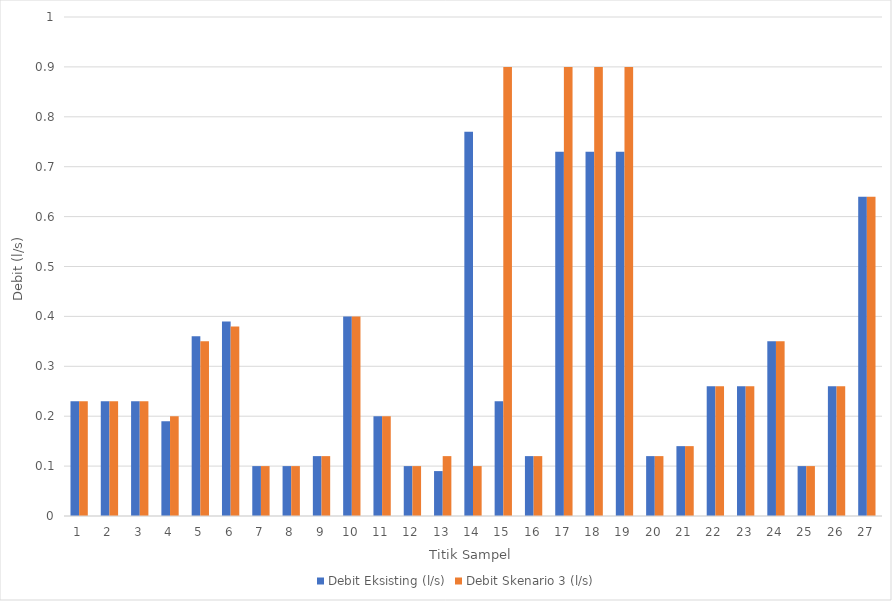
| Category | Debit Eksisting (l/s) | Debit Skenario 3 (l/s) |
|---|---|---|
| 0 | 0.23 | 0.23 |
| 1 | 0.23 | 0.23 |
| 2 | 0.23 | 0.23 |
| 3 | 0.19 | 0.2 |
| 4 | 0.36 | 0.35 |
| 5 | 0.39 | 0.38 |
| 6 | 0.1 | 0.1 |
| 7 | 0.1 | 0.1 |
| 8 | 0.12 | 0.12 |
| 9 | 0.4 | 0.4 |
| 10 | 0.2 | 0.2 |
| 11 | 0.1 | 0.1 |
| 12 | 0.09 | 0.12 |
| 13 | 0.77 | 0.1 |
| 14 | 0.23 | 0.9 |
| 15 | 0.12 | 0.12 |
| 16 | 0.73 | 0.9 |
| 17 | 0.73 | 0.9 |
| 18 | 0.73 | 0.9 |
| 19 | 0.12 | 0.12 |
| 20 | 0.14 | 0.14 |
| 21 | 0.26 | 0.26 |
| 22 | 0.26 | 0.26 |
| 23 | 0.35 | 0.35 |
| 24 | 0.1 | 0.1 |
| 25 | 0.26 | 0.26 |
| 26 | 0.64 | 0.64 |